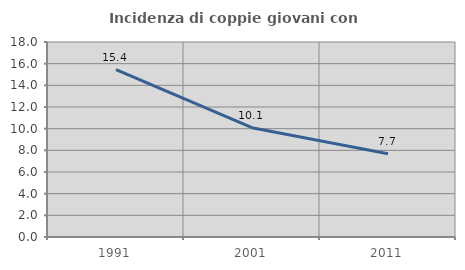
| Category | Incidenza di coppie giovani con figli |
|---|---|
| 1991.0 | 15.441 |
| 2001.0 | 10.092 |
| 2011.0 | 7.692 |